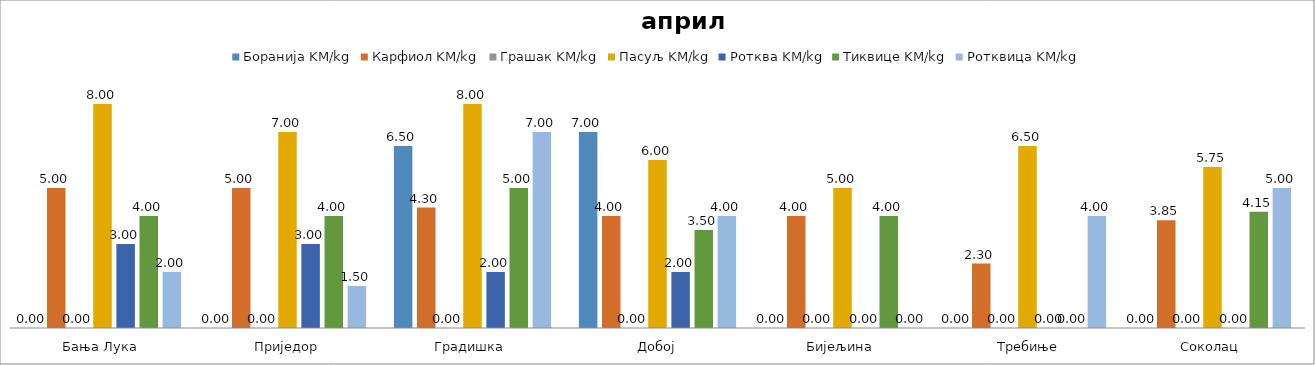
| Category | Боранија KM/kg | Карфиол KM/kg | Грашак KM/kg | Пасуљ KM/kg | Ротква KM/kg | Тиквице KM/kg | Ротквица KM/kg |
|---|---|---|---|---|---|---|---|
| Бања Лука | 0 | 5 | 0 | 8 | 3 | 4 | 2 |
| Приједор | 0 | 5 | 0 | 7 | 3 | 4 | 1.5 |
| Градишка | 6.5 | 4.3 | 0 | 8 | 2 | 5 | 7 |
| Добој | 7 | 4 | 0 | 6 | 2 | 3.5 | 4 |
| Бијељина | 0 | 4 | 0 | 5 | 0 | 4 | 0 |
|  Требиње | 0 | 2.3 | 0 | 6.5 | 0 | 0 | 4 |
| Соколац | 0 | 3.85 | 0 | 5.75 | 0 | 4.15 | 5 |